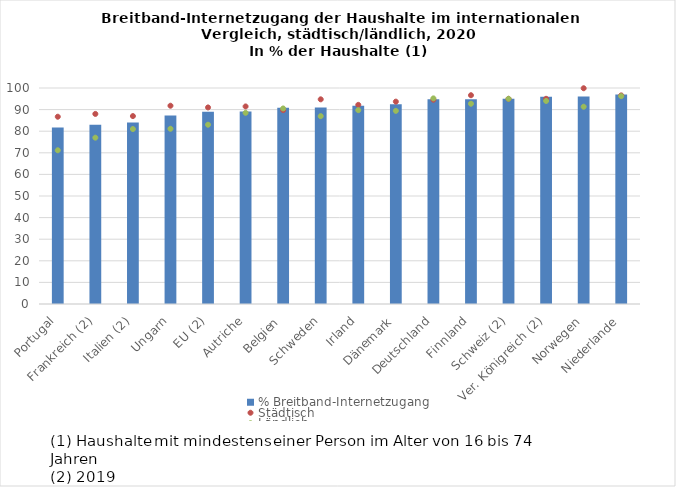
| Category | % Breitband-Internetzugang |
|---|---|
| Portugal | 81.666 |
| Frankreich (2) | 83 |
| Italien (2) | 84 |
| Ungarn | 87.231 |
| EU (2) | 89 |
| Autriche | 89.105 |
| Belgien | 90.861 |
| Schweden | 91 |
| Irland | 91.823 |
| Dänemark | 92.501 |
| Deutschland | 94.827 |
| Finnland | 94.827 |
| Schweiz (2) | 95 |
| Ver. Königreich (2) | 96 |
| Norwegen | 96.008 |
| Niederlande | 96.953 |